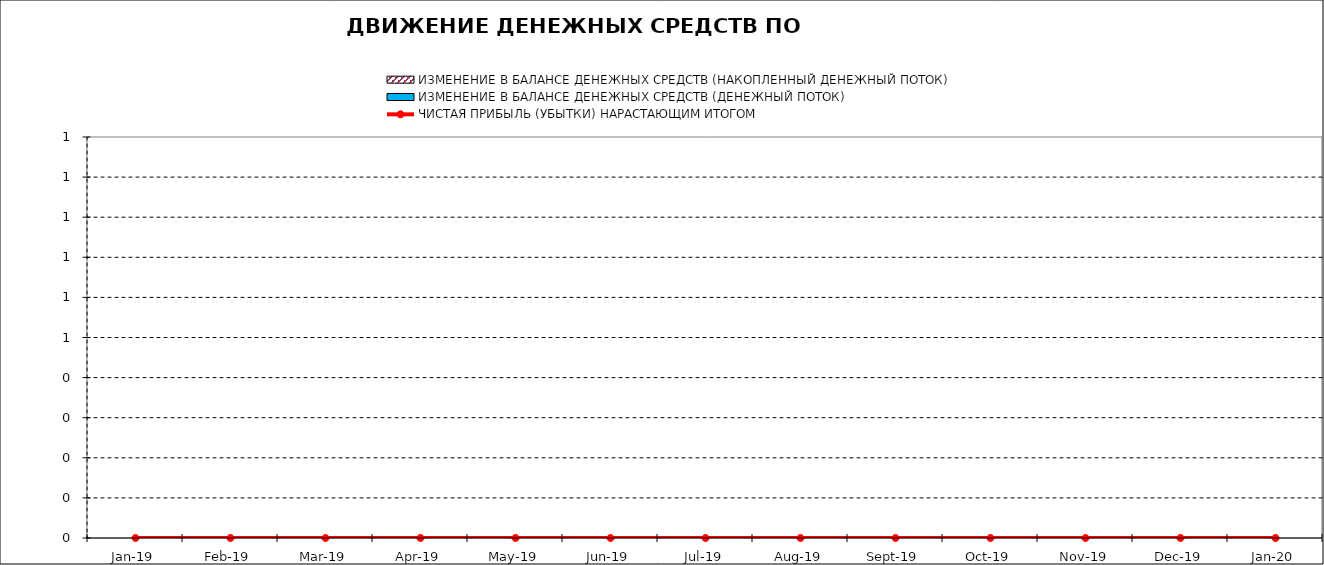
| Category | ИЗМЕНЕНИЕ В БАЛАНСЕ ДЕНЕЖНЫХ СРЕДСТВ (НАКОПЛЕННЫЙ ДЕНЕЖНЫЙ ПОТОК) | ИЗМЕНЕНИЕ В БАЛАНСЕ ДЕНЕЖНЫХ СРЕДСТВ (ДЕНЕЖНЫЙ ПОТОК) |
|---|---|---|
| 2019-01-01 | 0 | 0 |
| 2019-02-01 | 0 | 0 |
| 2019-03-04 | 0 | 0 |
| 2019-04-04 | 0 | 0 |
| 2019-05-05 | 0 | 0 |
| 2019-06-05 | 0 | 0 |
| 2019-07-06 | 0 | 0 |
| 2019-08-06 | 0 | 0 |
| 2019-09-06 | 0 | 0 |
| 2019-10-07 | 0 | 0 |
| 2019-11-07 | 0 | 0 |
| 2019-12-08 | 0 | 0 |
| 2020-01-08 | 0 | 0 |